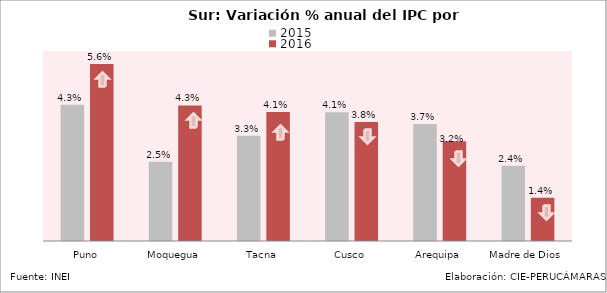
| Category | 2015 | 2016 |
|---|---|---|
| Puno | 0.043 | 0.056 |
| Moquegua | 0.025 | 0.043 |
| Tacna | 0.033 | 0.041 |
| Cusco | 0.041 | 0.038 |
| Arequipa | 0.037 | 0.032 |
| Madre de Dios | 0.024 | 0.014 |